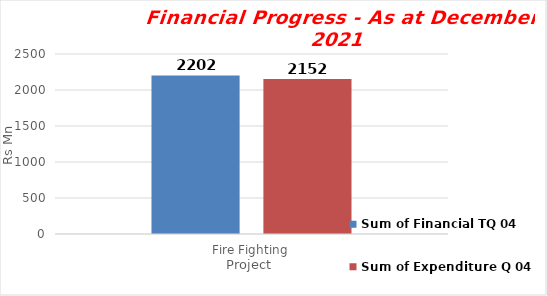
| Category | Sum of Financial TQ 04 | Sum of Expenditure Q 04 |
|---|---|---|
| Fire Fighting | 2202 | 2152 |